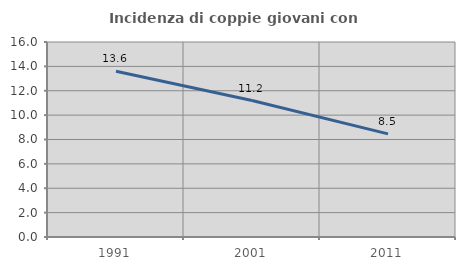
| Category | Incidenza di coppie giovani con figli |
|---|---|
| 1991.0 | 13.6 |
| 2001.0 | 11.194 |
| 2011.0 | 8.462 |